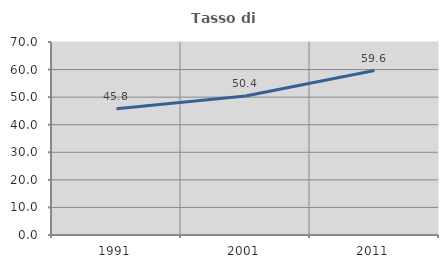
| Category | Tasso di occupazione   |
|---|---|
| 1991.0 | 45.756 |
| 2001.0 | 50.405 |
| 2011.0 | 59.65 |